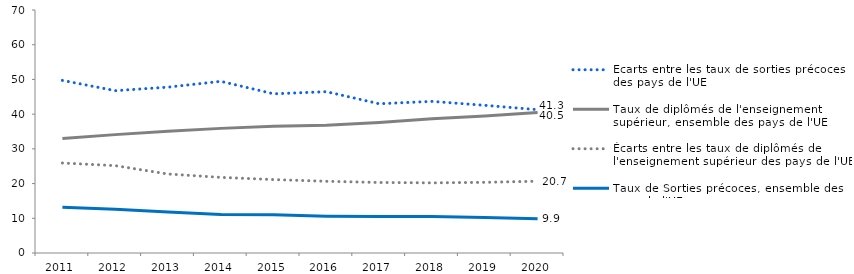
| Category | Écarts entre les taux de sorties précoces des pays de l'UE | Taux de diplômés de l'enseignement supérieur, ensemble des pays de l'UE | Écarts entre les taux de diplômés de l'enseignement supérieur des pays de l'UE | Taux de Sorties précoces, ensemble des pays de l'UE |
|---|---|---|---|---|
| 2011 | 49.724 | 33 | 25.924 | 13.2 |
| 2012 | 46.764 | 34.1 | 25.16 | 12.6 |
| 2013 | 47.776 | 35.1 | 22.756 | 11.8 |
| 2014 | 49.453 | 35.9 | 21.783 | 11.1 |
| 2015 | 45.855 | 36.5 | 21.151 | 11 |
| 2016 | 46.469 | 36.8 | 20.657 | 10.6 |
| 2017 | 42.992 | 37.6 | 20.315 | 10.5 |
| 2018 | 43.677 | 38.7 | 20.209 | 10.5 |
| 2019 | 42.537 | 39.5 | 20.359 | 10.2 |
| 2020 | 41.293 | 40.5 | 20.678 | 9.9 |